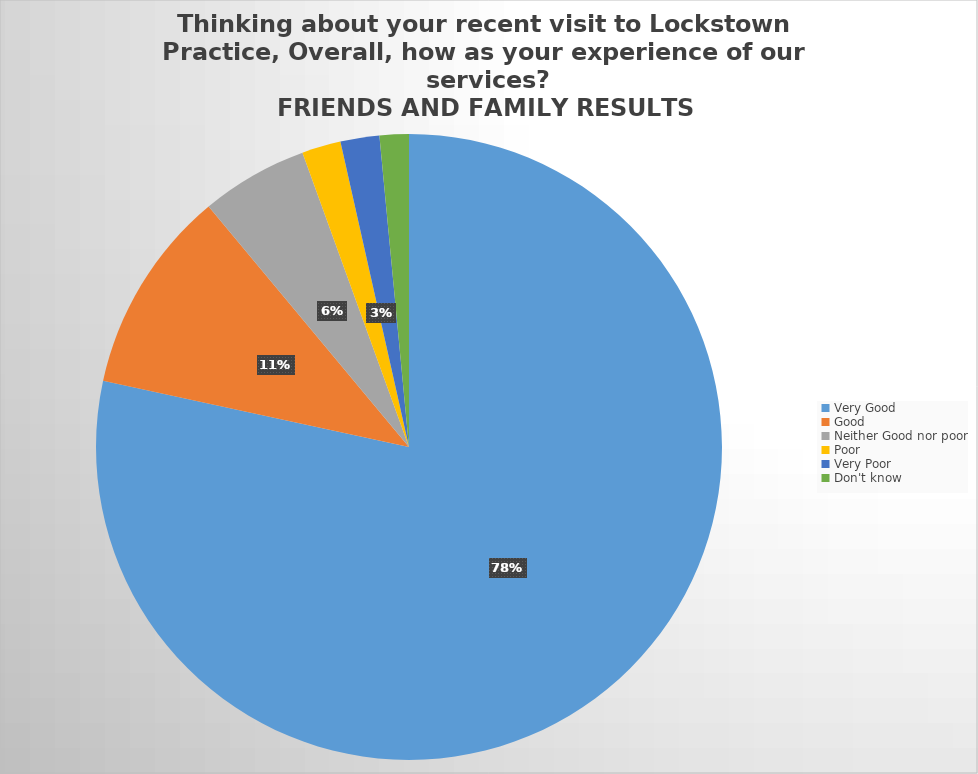
| Category | Responses |
|---|---|
| Very Good | 156 |
| Good | 21 |
| Neither Good nor poor | 11 |
| Poor | 4 |
| Very Poor | 4 |
| Don't know  | 3 |